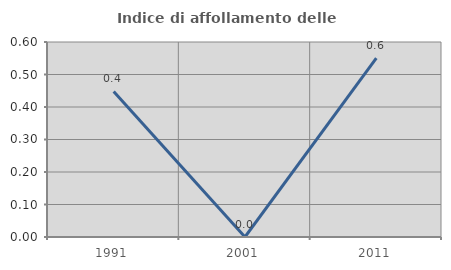
| Category | Indice di affollamento delle abitazioni  |
|---|---|
| 1991.0 | 0.448 |
| 2001.0 | 0 |
| 2011.0 | 0.55 |